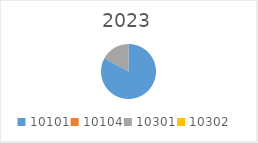
| Category | Series 0 |
|---|---|
| 10101.0 | 5840612 |
| 10104.0 | 0 |
| 10301.0 | 1190000 |
| 10302.0 | 0 |